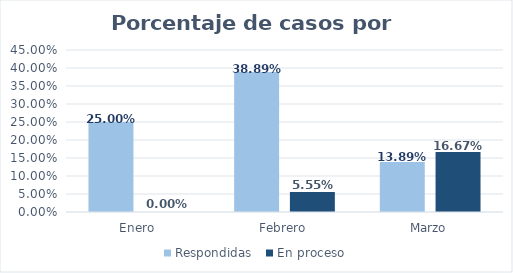
| Category | Respondidas  | En proceso |
|---|---|---|
| Enero | 0.25 | 0 |
| Febrero | 0.389 | 0.056 |
| Marzo | 0.139 | 0.167 |